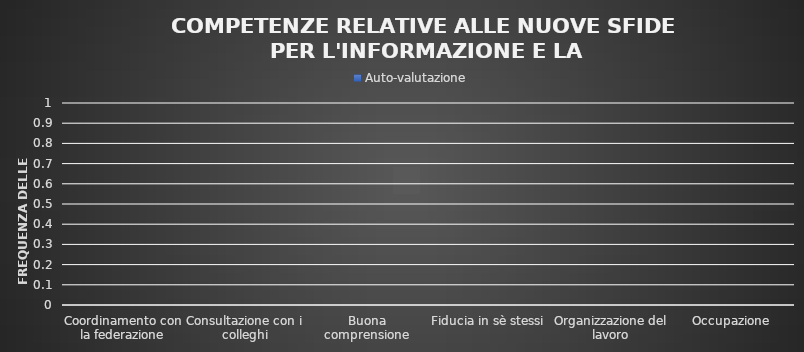
| Category | Auto-valutazione |
|---|---|
| Coordinamento con la federazione | 0 |
| Consultazione con i colleghi | 0 |
| Buona comprensione | 0 |
| Fiducia in sè stessi | 0 |
| Organizzazione del lavoro | 0 |
| Occupazione | 0 |